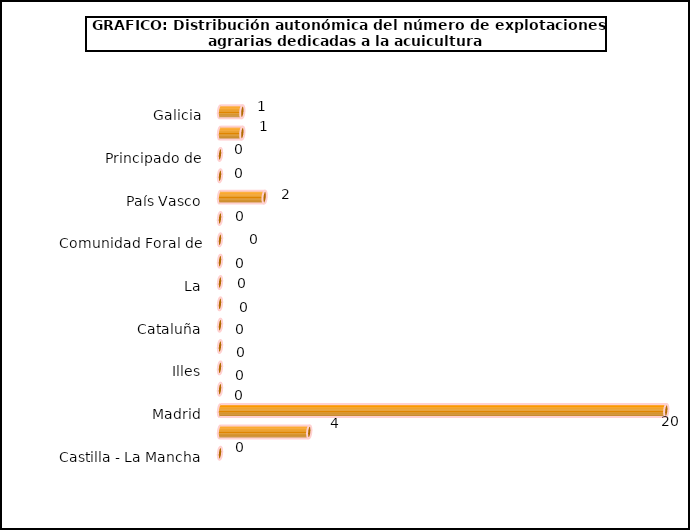
| Category | num. Explotaciones |
|---|---|
| 0 | 1 |
| 1 | 1 |
| 2 | 0 |
| 3 | 0 |
| 4 | 2 |
| 5 | 0 |
| 6 | 0 |
| 7 | 0 |
| 8 | 0 |
| 9 | 0 |
| 10 | 0 |
| 11 | 0 |
| 12 | 0 |
| 13 | 0 |
| 14 | 20 |
| 15 | 4 |
| 16 | 0 |